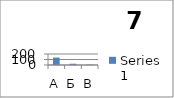
| Category | Series 0 |
|---|---|
| А | 135 |
| Б | 23 |
| В | 6 |